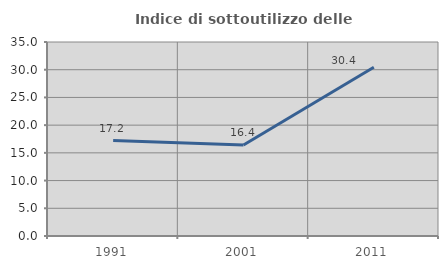
| Category | Indice di sottoutilizzo delle abitazioni  |
|---|---|
| 1991.0 | 17.219 |
| 2001.0 | 16.418 |
| 2011.0 | 30.435 |